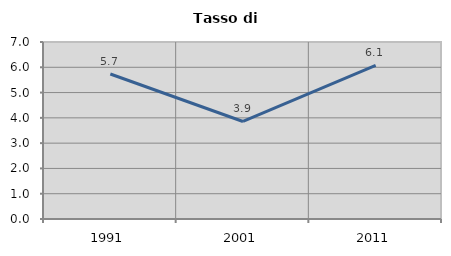
| Category | Tasso di disoccupazione   |
|---|---|
| 1991.0 | 5.734 |
| 2001.0 | 3.857 |
| 2011.0 | 6.076 |